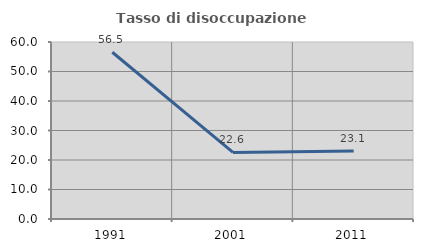
| Category | Tasso di disoccupazione giovanile  |
|---|---|
| 1991.0 | 56.522 |
| 2001.0 | 22.581 |
| 2011.0 | 23.077 |